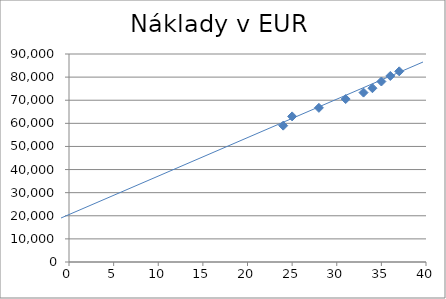
| Category | Series 0 |
|---|---|
| 25.0 | 63000 |
| 24.0 | 59000 |
| 31.0 | 70500 |
| 33.0 | 73300 |
| 28.0 | 66700 |
| 36.0 | 80500 |
| 35.0 | 78100 |
| 34.0 | 75200 |
| 37.0 | 82500 |